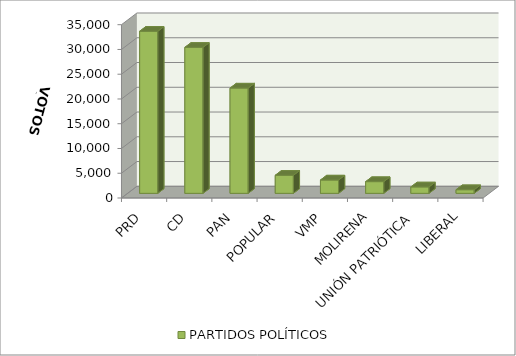
| Category | PARTIDOS POLÍTICOS |
|---|---|
| PRD | 32734 |
| CD | 29480 |
| PAN | 21262 |
| POPULAR | 3646 |
| VMP | 2690 |
| MOLIRENA | 2365 |
| UNIÓN PATRIÓTICA | 1294 |
| LIBERAL | 734 |